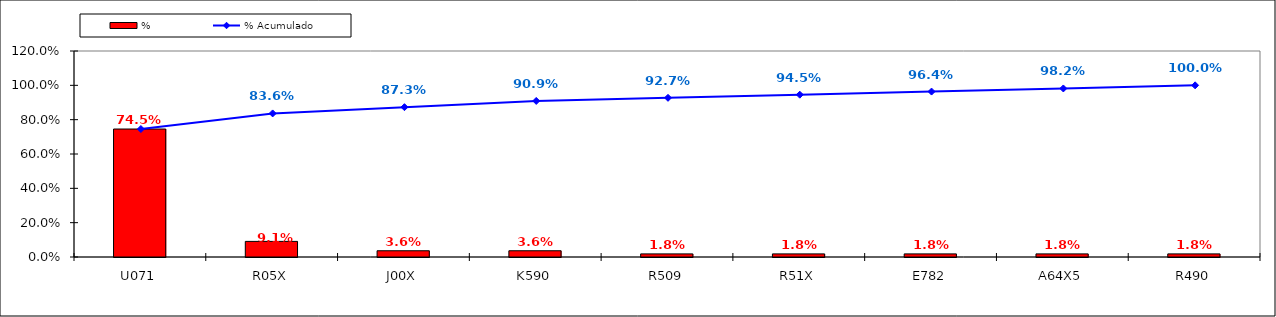
| Category | % |
|---|---|
| U071 | 0.745 |
| R05X | 0.091 |
| J00X | 0.036 |
| K590 | 0.036 |
| R509 | 0.018 |
| R51X | 0.018 |
| E782 | 0.018 |
| A64X5 | 0.018 |
| R490 | 0.018 |